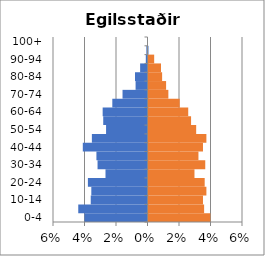
| Category | % Men | % Women |
|---|---|---|
| 0-4 | -0.04 | 0.039 |
| 5-9 | -0.044 | 0.035 |
| 10-14 | -0.036 | 0.035 |
| 15-19 | -0.036 | 0.037 |
| 20-24 | -0.038 | 0.036 |
| 25-29 | -0.027 | 0.029 |
| 30-34 | -0.032 | 0.036 |
| 35-39 | -0.032 | 0.032 |
| 40-44 | -0.041 | 0.035 |
| 45-49 | -0.035 | 0.037 |
| 50-54 | -0.026 | 0.03 |
| 55-59 | -0.028 | 0.027 |
| 60-64 | -0.028 | 0.025 |
| 65-69 | -0.022 | 0.02 |
| 70-74 | -0.016 | 0.013 |
| 75-79 | -0.008 | 0.011 |
| 80-84 | -0.008 | 0.009 |
| 85-89 | -0.005 | 0.008 |
| 90-94 | -0.001 | 0.004 |
| 95-99 | -0.001 | 0 |
| 100+ | 0 | 0 |